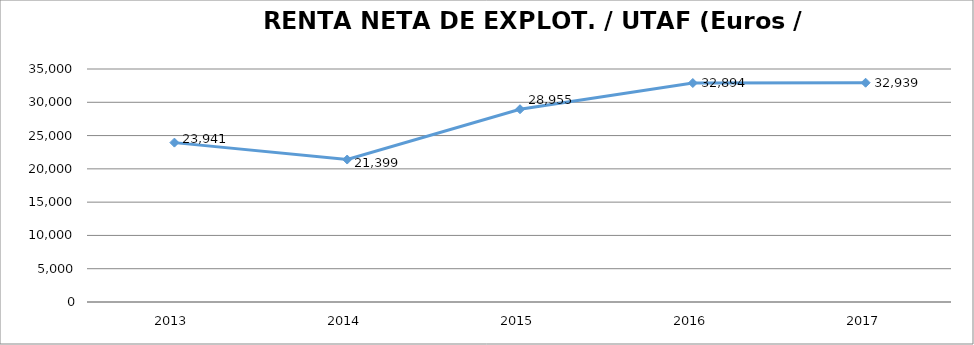
| Category | 2013 |
|---|---|
| 2013.0 | 23940.703 |
| 2014.0 | 21399.089 |
| 2015.0 | 28955.232 |
| 2016.0 | 32894.478 |
| 2017.0 | 32938.776 |